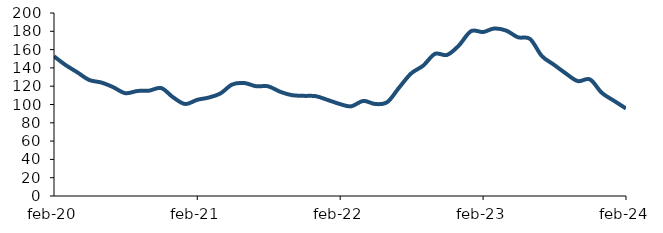
| Category | Series 0 |
|---|---|
| 2020-02-01 | 152.669 |
| 2020-03-01 | 143.292 |
| 2020-04-01 | 135.035 |
| 2020-05-01 | 126.788 |
| 2020-06-01 | 124.002 |
| 2020-07-01 | 118.983 |
| 2020-08-01 | 112.386 |
| 2020-09-01 | 114.763 |
| 2020-10-01 | 115.159 |
| 2020-11-01 | 117.935 |
| 2020-12-01 | 107.927 |
| 2021-01-01 | 100.528 |
| 2021-02-01 | 105.144 |
| 2021-03-01 | 107.453 |
| 2021-04-01 | 112.047 |
| 2021-05-01 | 121.818 |
| 2021-06-01 | 123.47 |
| 2021-07-01 | 119.987 |
| 2021-08-01 | 119.848 |
| 2021-09-01 | 113.862 |
| 2021-10-01 | 110.18 |
| 2021-11-01 | 109.442 |
| 2021-12-01 | 109.08 |
| 2022-01-01 | 104.823 |
| 2022-02-01 | 100.399 |
| 2022-03-01 | 98.015 |
| 2022-04-01 | 103.921 |
| 2022-05-01 | 100.574 |
| 2022-06-01 | 102.532 |
| 2022-07-01 | 118.21 |
| 2022-08-01 | 133.857 |
| 2022-09-01 | 142.486 |
| 2022-10-01 | 155.309 |
| 2022-11-01 | 154.196 |
| 2022-12-01 | 164.427 |
| 2023-01-01 | 180.097 |
| 2023-02-01 | 179.205 |
| 2023-03-01 | 183.022 |
| 2023-04-01 | 180.781 |
| 2023-05-01 | 173.469 |
| 2023-06-01 | 171.618 |
| 2023-07-01 | 153.008 |
| 2023-08-01 | 143.474 |
| 2023-09-01 | 133.698 |
| 2023-10-01 | 125.58 |
| 2023-11-01 | 127.415 |
| 2023-12-01 | 112.828 |
| 2024-01-01 | 104.142 |
| 2024-02-01 | 95.641 |